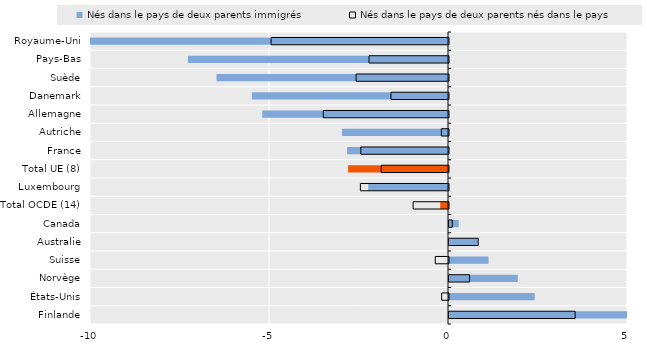
| Category | Nés dans le pays de deux parents immigrés | Nés dans le pays de deux parents nés dans le pays |
|---|---|---|
| Royaume-Uni | -10.031 | -4.954 |
| Pays-Bas | -7.263 | -2.22 |
| Suède | -6.466 | -2.581 |
| Danemark | -5.477 | -1.607 |
| Allemagne | -5.189 | -3.499 |
| Autriche | -2.962 | -0.199 |
| France | -2.819 | -2.449 |
| Total UE (8) | -2.791 | -1.878 |
| Luxembourg | -2.23 | -2.462 |
| Total OCDE (14) | -0.217 | -0.988 |
| Canada | 0.271 | 0.091 |
| Australie | 0.808 | 0.816 |
| Suisse | 1.104 | -0.369 |
| Norvège | 1.92 | 0.575 |
| États-Unis | 2.393 | -0.191 |
| Finlande | 11.135 | 3.524 |